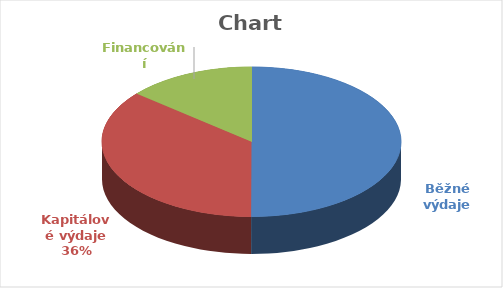
| Category | Series 0 |
|---|---|
| Běžné výdaje | 119653133.104 |
| Kapitálové výdaje | 86174849 |
| Financování | 33279218.896 |